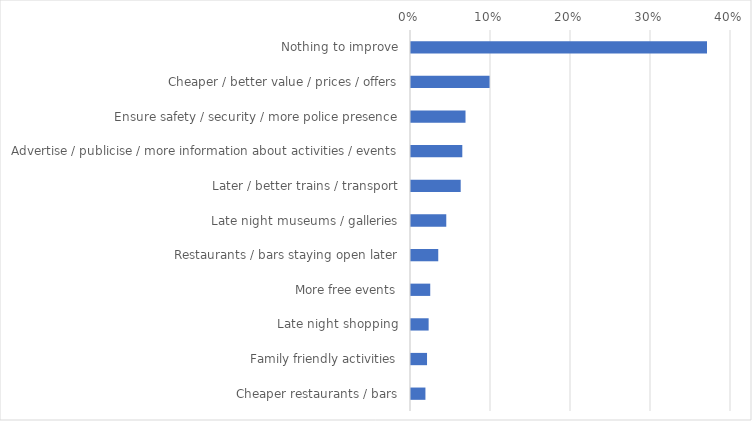
| Category | Percent |
|---|---|
| Nothing to improve | 0.37 |
| Cheaper / better value / prices / offers | 0.098 |
| Ensure safety / security / more police presence | 0.068 |
| Advertise / publicise / more information about activities / events | 0.064 |
| Later / better trains / transport | 0.062 |
| Late night museums / galleries | 0.044 |
| Restaurants / bars staying open later | 0.034 |
| More free events | 0.024 |
| Late night shopping | 0.022 |
| Family friendly activities | 0.02 |
| Cheaper restaurants / bars | 0.018 |